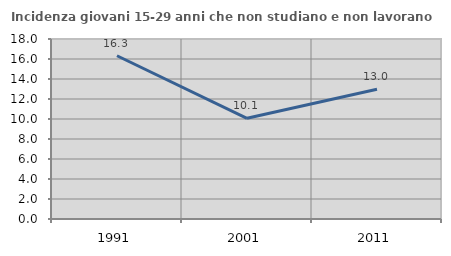
| Category | Incidenza giovani 15-29 anni che non studiano e non lavorano  |
|---|---|
| 1991.0 | 16.327 |
| 2001.0 | 10.067 |
| 2011.0 | 12.978 |